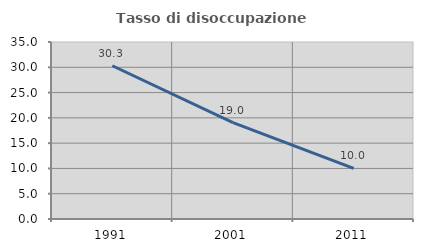
| Category | Tasso di disoccupazione giovanile  |
|---|---|
| 1991.0 | 30.303 |
| 2001.0 | 19.048 |
| 2011.0 | 10 |